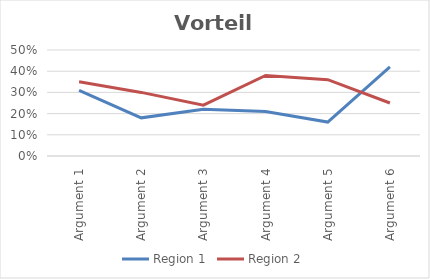
| Category | Region 1 | Region 2 |
|---|---|---|
| Argument 1 | 0.31 | 0.35 |
| Argument 2 | 0.18 | 0.3 |
| Argument 3 | 0.22 | 0.24 |
| Argument 4 | 0.21 | 0.38 |
| Argument 5 | 0.16 | 0.36 |
| Argument 6 | 0.42 | 0.25 |